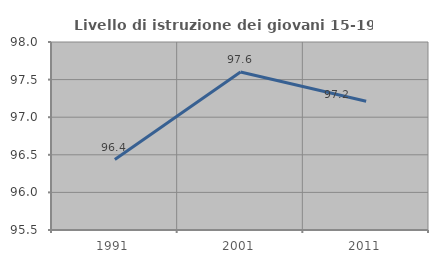
| Category | Livello di istruzione dei giovani 15-19 anni |
|---|---|
| 1991.0 | 96.437 |
| 2001.0 | 97.601 |
| 2011.0 | 97.211 |